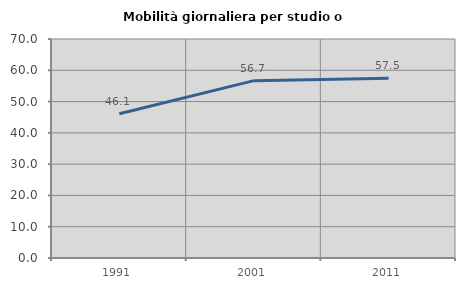
| Category | Mobilità giornaliera per studio o lavoro |
|---|---|
| 1991.0 | 46.086 |
| 2001.0 | 56.686 |
| 2011.0 | 57.492 |